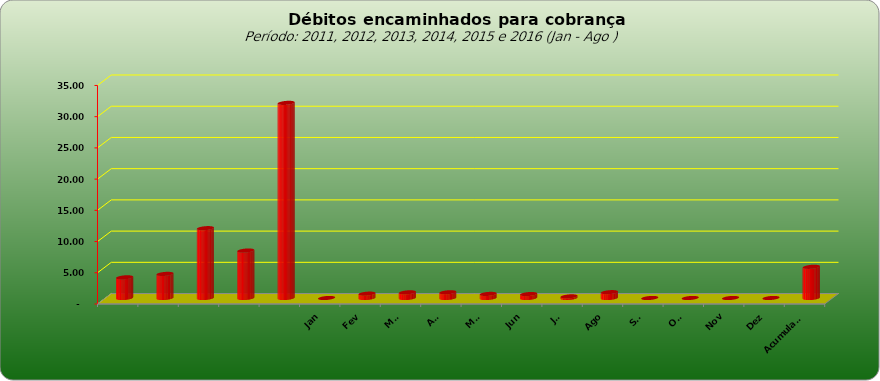
| Category |  3.309.443,02  |
|---|---|
|  | 3309443.02 |
|  | 3859728.44 |
|  | 11181928.25 |
|  | 7600526.01 |
|  | 31248623.5 |
| Jan | 0 |
| Fev | 695716.82 |
| Mar | 906394.22 |
| Abr | 915013.51 |
| Mai | 654375.79 |
| Jun | 631930.49 |
| Jul | 259089.26 |
| Ago | 932827.69 |
| Set | 0 |
| Out | 0 |
| Nov | 0 |
| Dez | 0 |
| Acumulado | 4995347.78 |